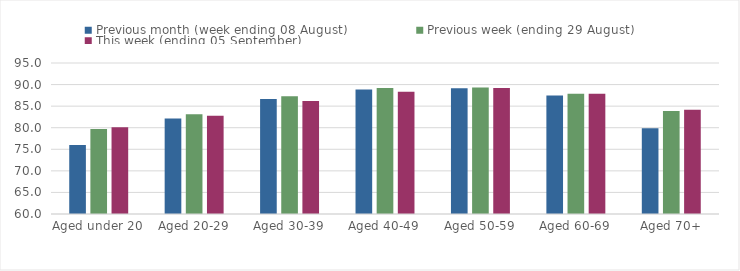
| Category | Previous month (week ending 08 August) | Previous week (ending 29 August) | This week (ending 05 September) |
|---|---|---|---|
| Aged under 20 | 76 | 79.7 | 80.12 |
| Aged 20-29 | 82.14 | 83.12 | 82.78 |
| Aged 30-39 | 86.65 | 87.27 | 86.22 |
| Aged 40-49 | 88.84 | 89.18 | 88.33 |
| Aged 50-59 | 89.12 | 89.33 | 89.2 |
| Aged 60-69 | 87.46 | 87.89 | 87.86 |
| Aged 70+ | 79.89 | 83.86 | 84.19 |